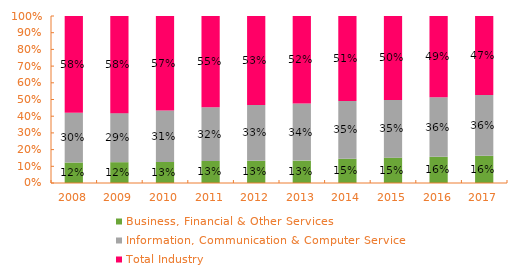
| Category | Business, Financial & Other Services | Information, Communication & Computer Services | Total Industry |
|---|---|---|---|
| 2008.0 | 0.123 | 0.297 | 0.58 |
| 2009.0 | 0.125 | 0.294 | 0.582 |
| 2010.0 | 0.126 | 0.308 | 0.566 |
| 2011.0 | 0.132 | 0.322 | 0.546 |
| 2012.0 | 0.133 | 0.334 | 0.533 |
| 2013.0 | 0.134 | 0.342 | 0.524 |
| 2014.0 | 0.145 | 0.346 | 0.509 |
| 2015.0 | 0.152 | 0.346 | 0.502 |
| 2016.0 | 0.157 | 0.356 | 0.487 |
| 2017.0 | 0.163 | 0.365 | 0.473 |